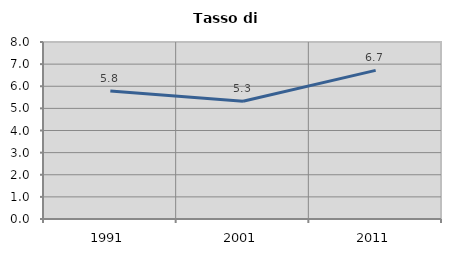
| Category | Tasso di disoccupazione   |
|---|---|
| 1991.0 | 5.786 |
| 2001.0 | 5.321 |
| 2011.0 | 6.717 |